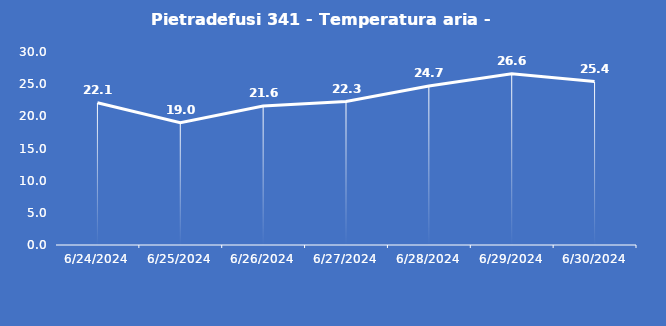
| Category | Pietradefusi 341 - Temperatura aria - Grezzo (°C) |
|---|---|
| 6/24/24 | 22.1 |
| 6/25/24 | 19 |
| 6/26/24 | 21.6 |
| 6/27/24 | 22.3 |
| 6/28/24 | 24.7 |
| 6/29/24 | 26.6 |
| 6/30/24 | 25.4 |